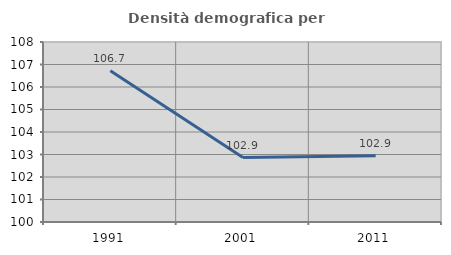
| Category | Densità demografica |
|---|---|
| 1991.0 | 106.725 |
| 2001.0 | 102.863 |
| 2011.0 | 102.947 |